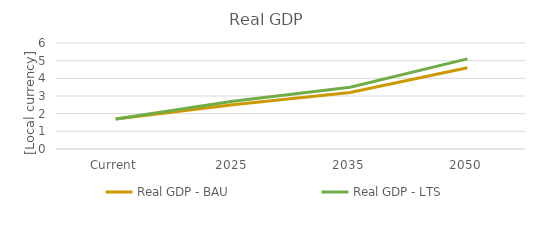
| Category | Real GDP - BAU | Real GDP - LTS |
|---|---|---|
| Current | 1.7 | 1.7 |
| 2025 | 2.5 | 2.7 |
| 2035 | 3.2 | 3.5 |
| 2050 | 4.6 | 5.1 |